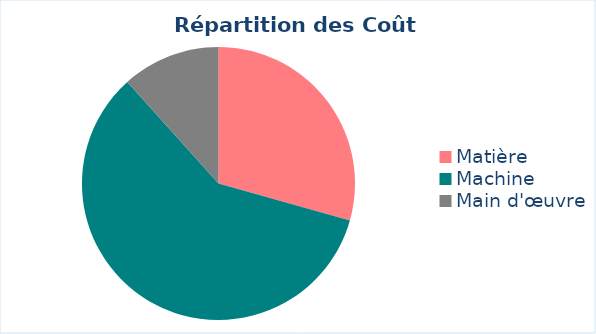
| Category | Series 0 | Series 1 |
|---|---|---|
| Matière | 3665.5 |  |
| Machine | 7360 |  |
| Main d'œuvre | 1454.2 |  |